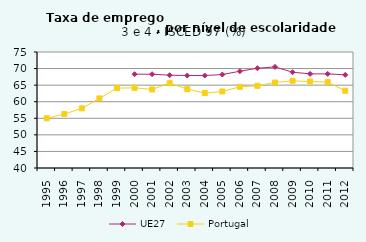
| Category | UE27 | Portugal |
|---|---|---|
| 1995.0 | 0 | 55 |
| 1996.0 | 0 | 56.3 |
| 1997.0 | 0 | 58 |
| 1998.0 | 0 | 61 |
| 1999.0 | 0 | 64.1 |
| 2000.0 | 68.3 | 64.2 |
| 2001.0 | 68.3 | 63.7 |
| 2002.0 | 68 | 65.6 |
| 2003.0 | 67.9 | 63.8 |
| 2004.0 | 67.9 | 62.6 |
| 2005.0 | 68.2 | 63.1 |
| 2006.0 | 69.2 | 64.5 |
| 2007.0 | 70.1 | 64.8 |
| 2008.0 | 70.5 | 65.8 |
| 2009.0 | 68.9 | 66.3 |
| 2010.0 | 68.4 | 66.1 |
| 2011.0 | 68.4 | 65.9 |
| 2012.0 | 68.1 | 63.3 |